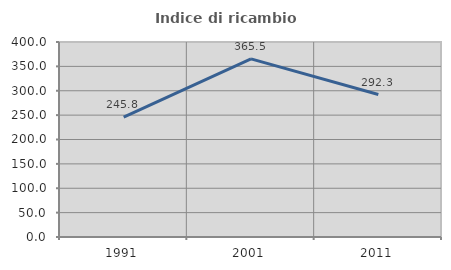
| Category | Indice di ricambio occupazionale  |
|---|---|
| 1991.0 | 245.833 |
| 2001.0 | 365.481 |
| 2011.0 | 292.273 |